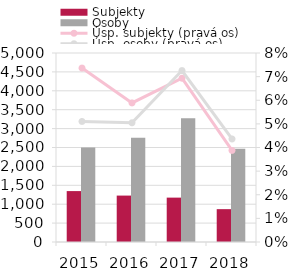
| Category | Subjekty | Osoby |
|---|---|---|
| 2015.0 | 1347 | 2501 |
| 2016.0 | 1228 | 2756 |
| 2017.0 | 1174 | 3275 |
| 2018.0 | 869 | 2470 |